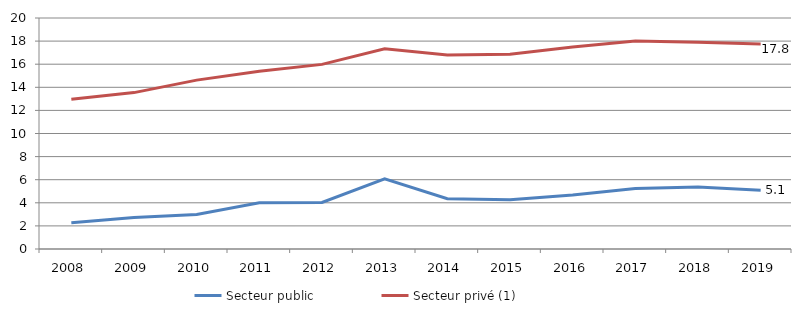
| Category | Secteur public | Secteur privé (1) |
|---|---|---|
| 2008.0 | 2.276 | 12.96 |
| 2009.0 | 2.719 | 13.541 |
| 2010.0 | 2.996 | 14.623 |
| 2011.0 | 4.004 | 15.382 |
| 2012.0 | 4.036 | 15.983 |
| 2013.0 | 6.068 | 17.339 |
| 2014.0 | 4.355 | 16.801 |
| 2015.0 | 4.258 | 16.867 |
| 2016.0 | 4.681 | 17.498 |
| 2017.0 | 5.24 | 18.002 |
| 2018.0 | 5.357 | 17.903 |
| 2019.0 | 5.092 | 17.753 |